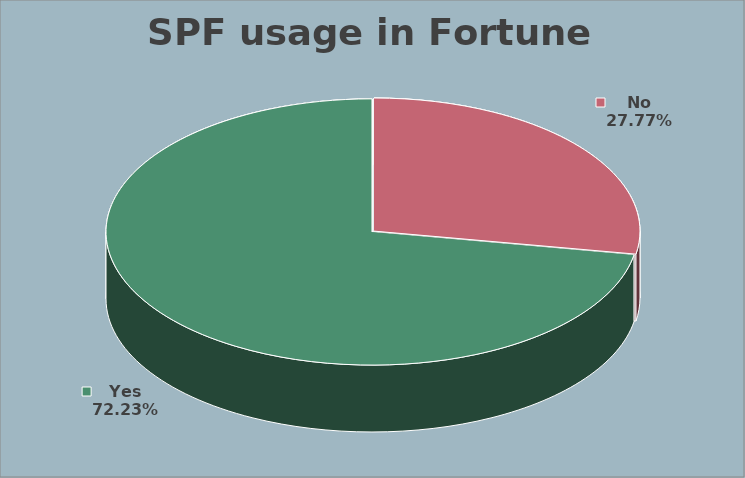
| Category | Total |
|---|---|
| No | 128 |
| Yes | 333 |